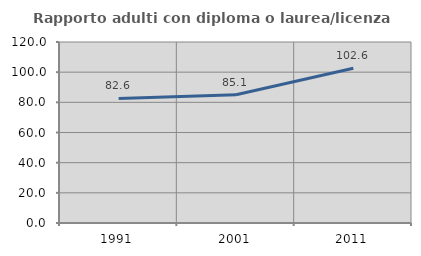
| Category | Rapporto adulti con diploma o laurea/licenza media  |
|---|---|
| 1991.0 | 82.6 |
| 2001.0 | 85.061 |
| 2011.0 | 102.614 |